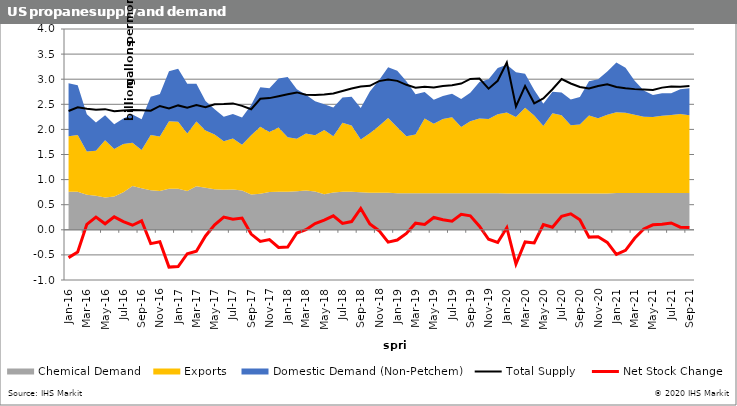
| Category | Total Supply  | Net Stock Change  |
|---|---|---|
| 2016-01-15 | 2.367 | -0.554 |
| 2016-02-15 | 2.439 | -0.44 |
| 2016-03-15 | 2.413 | 0.11 |
| 2016-04-15 | 2.392 | 0.254 |
| 2016-05-15 | 2.404 | 0.119 |
| 2016-06-15 | 2.36 | 0.258 |
| 2016-07-15 | 2.379 | 0.163 |
| 2016-08-15 | 2.388 | 0.091 |
| 2016-09-15 | 2.381 | 0.179 |
| 2016-10-15 | 2.373 | -0.275 |
| 2016-11-15 | 2.466 | -0.24 |
| 2016-12-15 | 2.417 | -0.743 |
| 2017-01-15 | 2.478 | -0.732 |
| 2017-02-15 | 2.431 | -0.477 |
| 2017-03-15 | 2.484 | -0.428 |
| 2017-04-15 | 2.444 | -0.122 |
| 2017-05-15 | 2.502 | 0.099 |
| 2017-06-15 | 2.505 | 0.252 |
| 2017-07-15 | 2.518 | 0.213 |
| 2017-08-15 | 2.469 | 0.234 |
| 2017-09-15 | 2.402 | -0.085 |
| 2017-10-15 | 2.611 | -0.231 |
| 2017-11-15 | 2.623 | -0.194 |
| 2017-12-15 | 2.662 | -0.35 |
| 2018-01-15 | 2.698 | -0.343 |
| 2018-02-15 | 2.737 | -0.063 |
| 2018-03-15 | 2.692 | 0.002 |
| 2018-04-15 | 2.683 | 0.123 |
| 2018-05-15 | 2.694 | 0.194 |
| 2018-06-15 | 2.713 | 0.278 |
| 2018-07-15 | 2.764 | 0.127 |
| 2018-08-15 | 2.814 | 0.165 |
| 2018-09-15 | 2.853 | 0.425 |
| 2018-10-15 | 2.868 | 0.115 |
| 2018-11-15 | 2.962 | -0.017 |
| 2018-12-15 | 2.993 | -0.245 |
| 2019-01-15 | 2.966 | -0.203 |
| 2019-02-15 | 2.888 | -0.073 |
| 2019-03-15 | 2.83 | 0.131 |
| 2019-04-15 | 2.85 | 0.106 |
| 2019-05-15 | 2.837 | 0.246 |
| 2019-06-15 | 2.866 | 0.2 |
| 2019-07-15 | 2.881 | 0.17 |
| 2019-08-15 | 2.913 | 0.309 |
| 2019-09-15 | 3.006 | 0.277 |
| 2019-10-15 | 3.014 | 0.071 |
| 2019-11-15 | 2.811 | -0.189 |
| 2019-12-15 | 2.969 | -0.253 |
| 2020-01-15 | 3.331 | 0.041 |
| 2020-02-15 | 2.457 | -0.681 |
| 2020-03-15 | 2.864 | -0.243 |
| 2020-04-15 | 2.52 | -0.263 |
| 2020-05-15 | 2.618 | 0.104 |
| 2020-06-15 | 2.8 | 0.05 |
| 2020-07-15 | 3.004 | 0.27 |
| 2020-08-15 | 2.915 | 0.319 |
| 2020-09-15 | 2.844 | 0.198 |
| 2020-10-15 | 2.814 | -0.145 |
| 2020-11-15 | 2.864 | -0.137 |
| 2020-12-15 | 2.899 | -0.252 |
| 2021-01-15 | 2.844 | -0.491 |
| 2021-02-15 | 2.818 | -0.408 |
| 2021-03-15 | 2.802 | -0.168 |
| 2021-04-15 | 2.793 | 0.017 |
| 2021-05-15 | 2.784 | 0.1 |
| 2021-06-15 | 2.832 | 0.112 |
| 2021-07-15 | 2.855 | 0.137 |
| 2021-08-15 | 2.851 | 0.052 |
| 2021-09-15 | 2.865 | 0.044 |